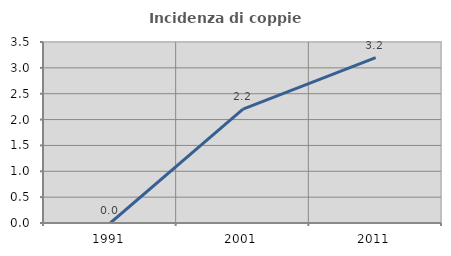
| Category | Incidenza di coppie miste |
|---|---|
| 1991.0 | 0 |
| 2001.0 | 2.203 |
| 2011.0 | 3.196 |